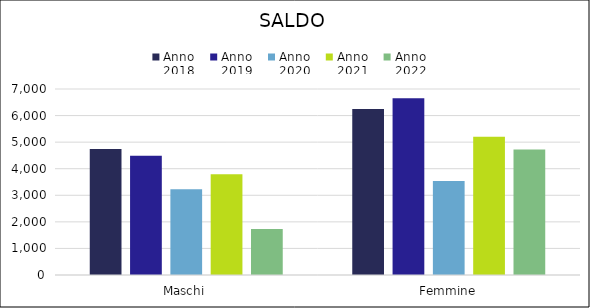
| Category | Anno
2018 | Anno
2019 | Anno
2020 | Anno
2021 | Anno
2022 |
|---|---|---|---|---|---|
| Maschi | 4742 | 4485 | 3226 | 3790 | 1731 |
| Femmine | 6251 | 6648 | 3535 | 5206 | 4725 |